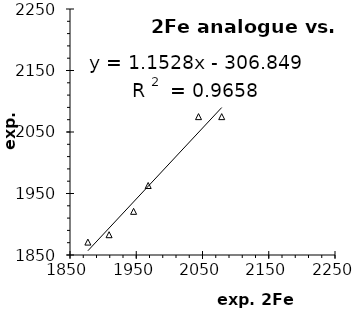
| Category | BP86 |
|---|---|
| 1877.0 | 1871 |
| 1909.0 | 1883 |
| 1946.0 | 1921 |
| 1968.0 | 1963 |
| 2044.0 | 2075 |
| 2079.0 | 2075 |